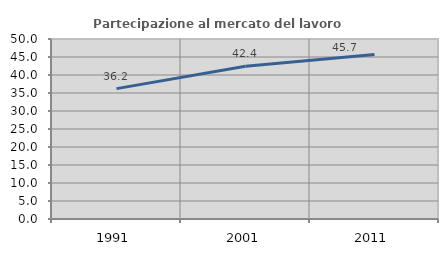
| Category | Partecipazione al mercato del lavoro  femminile |
|---|---|
| 1991.0 | 36.212 |
| 2001.0 | 42.419 |
| 2011.0 | 45.677 |